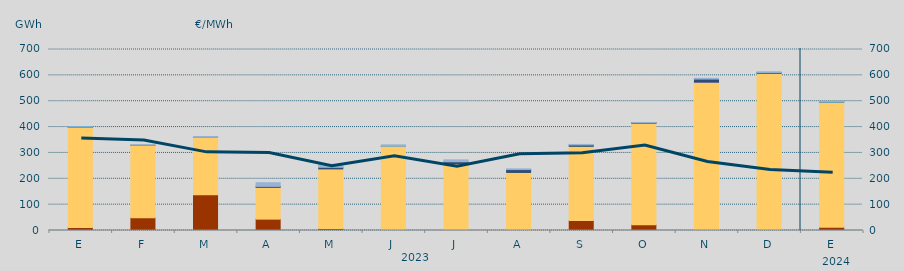
| Category | Carbón | Ciclo Combinado | Cogeneración | Consumo Bombeo | Enlace Península Baleares | Eólica | Hidráulica | Internacionales | Otras Renovables | Residuos no Renovables | Solar fotovoltaica | Solar térmica | Turbinación bombeo |
|---|---|---|---|---|---|---|---|---|---|---|---|---|---|
| E | 11268 | 387716.675 | 0 | 572.573 | 681.8 | 0 | 835.85 | 0 | 0 | 0 | 0 | 0 | 77.5 |
| F | 48958 | 280733.853 | 0 | 43.033 | 0 | 0 | 0 | 0 | 0 | 0 | 0 | 0 | 1846.75 |
| M | 138130.4 | 224071.017 | 0 | 316.875 | 152.4 | 0 | 0 | 0 | 0 | 0 | 0 | 0 | 717.667 |
| A | 43920 | 122955.6 | 0 | 4435.017 | 148.1 | 0 | 0 | 0 | 0 | 0 | 0 | 0 | 13251.877 |
| M | 8172.8 | 230037.608 | 0 | 6374.2 | 1318.3 | 0 | 0 | 0 | 0 | 0 | 0 | 0 | 9849.292 |
| J | 3400 | 321495.908 | 0 | 191.083 | 1224 | 175.975 | 0 | 0 | 0 | 0 | 0 | 0 | 4721.775 |
| J | 2260 | 255417.442 | 0 | 8045.584 | 1144 | 41.666 | 475 | 647.8 | 0 | 0 | 0 | 0 | 5129.95 |
| A | 2834 | 221717.226 | 0 | 11049.55 | 362 | 0 | 144.325 | 0 | 0 | 0 | 0 | 0 | 2296.991 |
| S | 38425 | 287082.594 | 0 | 5227.584 | 0 | 0 | 0 | 0 | 0 | 0 | 0 | 0 | 2105.767 |
| O | 22001.7 | 391922.459 | 600 | 1995.167 | 550.783 | 0 | 0 | 0 | 108.25 | 0 | 0 | 0 | 659.78 |
| N | 0 | 573207.834 | 491.7 | 12124.45 | 319.05 | 100 | 16.5 | 0 | 1115.767 | 0 | 0 | 0 | 1155.7 |
| D | 397.083 | 607349.126 | 0 | 2462.5 | 0 | 0 | 991 | 0 | 0 | 0 | 0 | 0 | 2414.918 |
| E | 12198.75 | 484724.1 | 0 | 596.033 | 0 | 0 | 200 | 0 | 0 | 0 | 0 | 0 | 1329.5 |